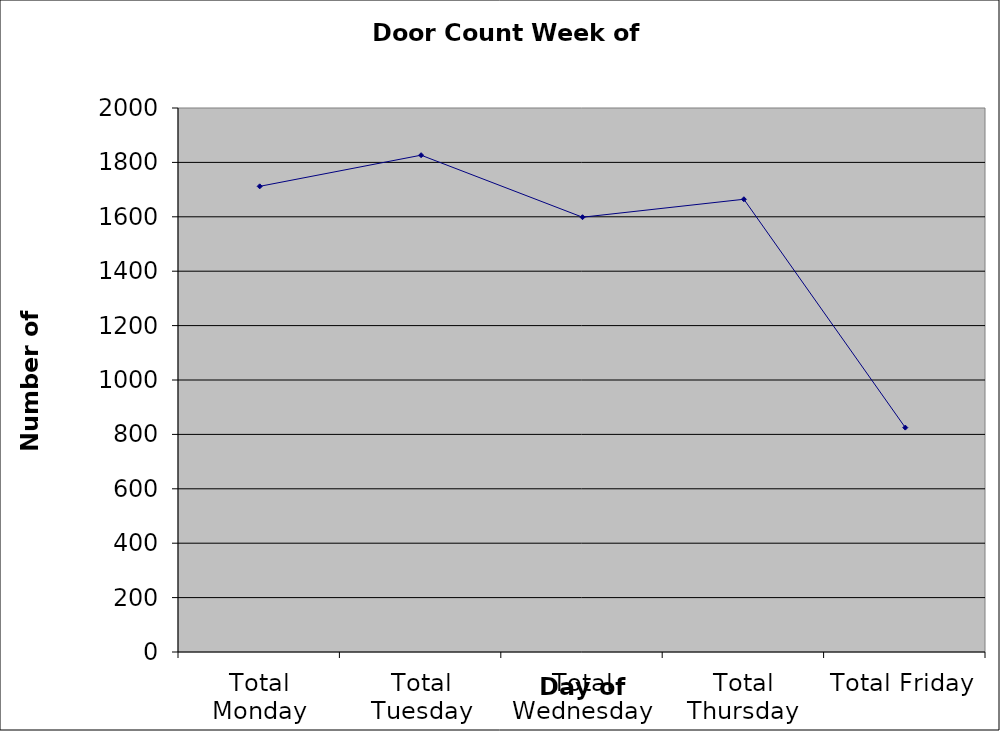
| Category | Series 0 |
|---|---|
| Total Monday | 1712 |
| Total Tuesday | 1826.5 |
| Total Wednesday | 1598.5 |
| Total Thursday | 1664.5 |
| Total Friday | 825 |